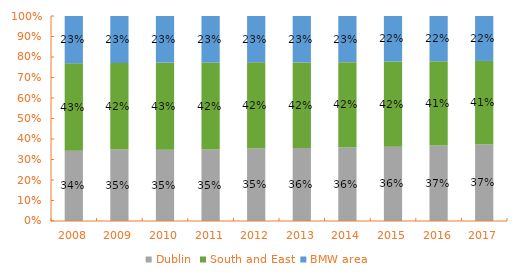
| Category | Dublin | South and East | BMW area |
|---|---|---|---|
| 2008.0 | 0.343 | 0.426 | 0.231 |
| 2009.0 | 0.35 | 0.421 | 0.229 |
| 2010.0 | 0.347 | 0.425 | 0.228 |
| 2011.0 | 0.349 | 0.423 | 0.228 |
| 2012.0 | 0.353 | 0.421 | 0.226 |
| 2013.0 | 0.356 | 0.417 | 0.227 |
| 2014.0 | 0.359 | 0.416 | 0.225 |
| 2015.0 | 0.362 | 0.416 | 0.222 |
| 2016.0 | 0.368 | 0.412 | 0.22 |
| 2017.0 | 0.373 | 0.408 | 0.219 |